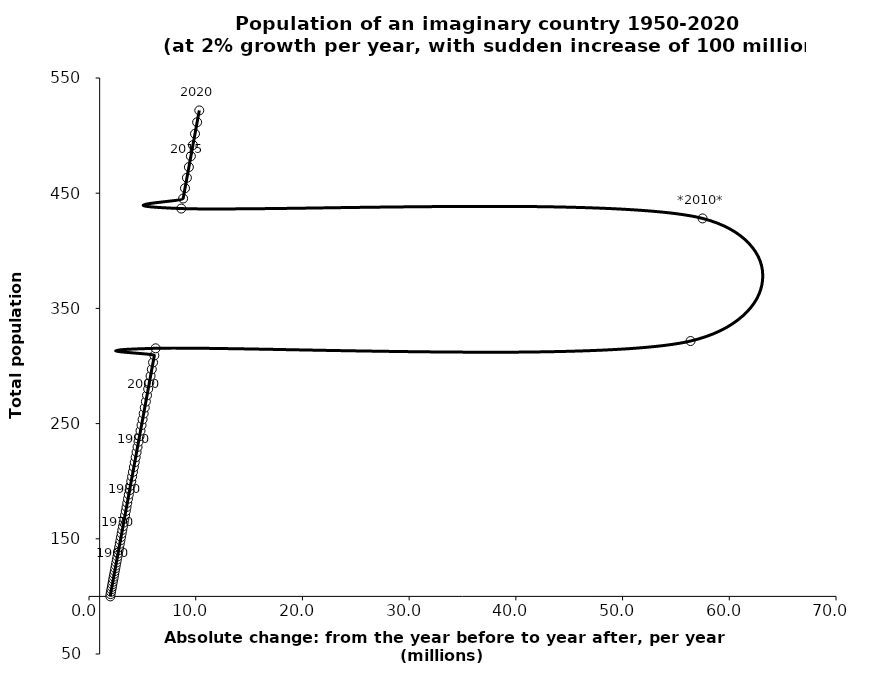
| Category | Series 0 |
|---|---|
| 2.0 | 100 |
| 2.020000000000003 | 102 |
| 2.0604000000000013 | 104.04 |
| 2.101607999999999 | 106.121 |
| 2.143640160000004 | 108.243 |
| 2.186512963200002 | 110.408 |
| 2.230243222463997 | 112.616 |
| 2.2748480869132806 | 114.869 |
| 2.3203450486515464 | 117.166 |
| 2.366751949624579 | 119.509 |
| 2.414086988617072 | 121.899 |
| 2.4623687283894142 | 124.337 |
| 2.5116161029572055 | 126.824 |
| 2.5618484250163434 | 129.361 |
| 2.61308539351667 | 131.948 |
| 2.665347101387013 | 134.587 |
| 2.718654043414759 | 137.279 |
| 2.773027124283047 | 140.024 |
| 2.8284876667686945 | 142.825 |
| 2.8850574201040757 | 145.681 |
| 2.9427585685061644 | 148.595 |
| 3.0016137398762766 | 151.567 |
| 3.061646014673798 | 154.598 |
| 3.122878934967275 | 157.69 |
| 3.185336513666627 | 160.844 |
| 3.2490432439399655 | 164.061 |
| 3.3140241088187565 | 167.342 |
| 3.3803045909951237 | 170.689 |
| 3.447910682815035 | 174.102 |
| 3.516868896471337 | 177.584 |
| 3.5872062744007565 | 181.136 |
| 3.6589503998887807 | 184.759 |
| 3.7321294078865606 | 188.454 |
| 3.80677199604429 | 192.223 |
| 3.88290743596518 | 196.068 |
| 3.960565584684474 | 199.989 |
| 4.039776896378157 | 203.989 |
| 4.120572434305728 | 208.069 |
| 4.202983882991845 | 212.23 |
| 4.287043560651682 | 216.474 |
| 4.372784431864716 | 220.804 |
| 4.460240120502007 | 225.22 |
| 4.549444922912045 | 229.724 |
| 4.64043382137028 | 234.319 |
| 4.73324249779769 | 239.005 |
| 4.827907347753651 | 243.785 |
| 4.924465494708727 | 248.661 |
| 5.02295480460289 | 253.634 |
| 5.123413900694942 | 258.707 |
| 5.225882178708844 | 263.881 |
| 5.330399822283027 | 269.159 |
| 5.437007818728688 | 274.542 |
| 5.545747975103268 | 280.033 |
| 5.65666293460535 | 285.633 |
| 5.769796193297452 | 291.346 |
| 5.885192117163399 | 297.173 |
| 6.002895959506674 | 303.117 |
| 6.122953878696791 | 309.179 |
| 6.245412956270712 | 315.362 |
| 56.37032121539613 | 321.67 |
| 57.49772763970407 | 428.103 |
| 8.647682192498166 | 436.665 |
| 8.820635836348117 | 445.398 |
| 8.997048553075075 | 454.306 |
| 9.176989524136587 | 463.393 |
| 9.3605293146193 | 472.66 |
| 9.547739900911665 | 482.114 |
| 9.738694698929919 | 491.756 |
| 9.933468592908525 | 501.591 |
| 10.132137964766713 | 511.623 |
| 10.334780724062028 | 521.855 |